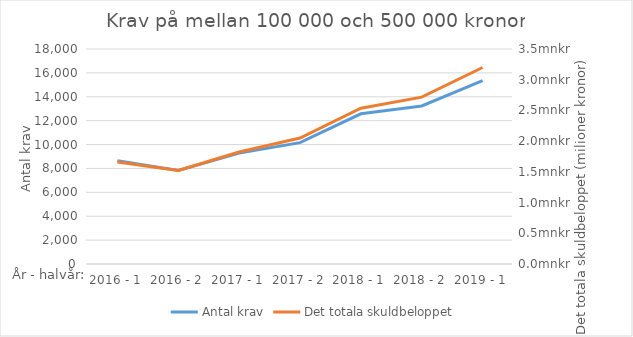
| Category | Antal krav |
|---|---|
| 2016 - 1 | 8643 |
| 2016 - 2 | 7825 |
| 2017 - 1 | 9285 |
| 2017 - 2 | 10160 |
| 2018 - 1 | 12577 |
| 2018 - 2 | 13228 |
| 2019 - 1 | 15354 |